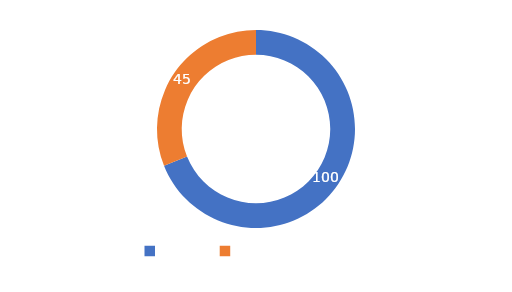
| Category | Series 0 |
|---|---|
| META  | 100 |
| CUMPLIMIENTO | 45 |